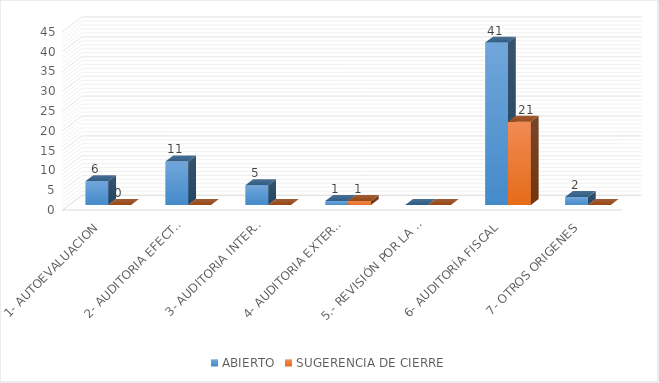
| Category | ABIERTO | SUGERENCIA DE CIERRE |
|---|---|---|
| 1- AUTOEVALUACION | 6 | 0 |
| 2- AUDITORIA EFECTUADA POR LA O.C.I. | 11 | 0 |
| 3- AUDITORIA INTERNA AL S.I.G | 5 | 0 |
| 4- AUDITORIA EXTERNA AL S.I.G | 1 | 1 |
| 5.- REVISIÓN POR LA DIRECCIÓN | 0 | 0 |
| 6- AUDITORÍA FISCAL | 41 | 21 |
| 7- OTROS ORIGENES | 2 | 0 |